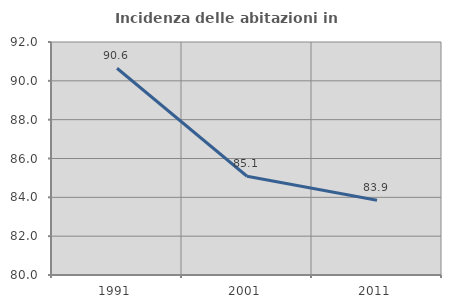
| Category | Incidenza delle abitazioni in proprietà  |
|---|---|
| 1991.0 | 90.647 |
| 2001.0 | 85.085 |
| 2011.0 | 83.851 |